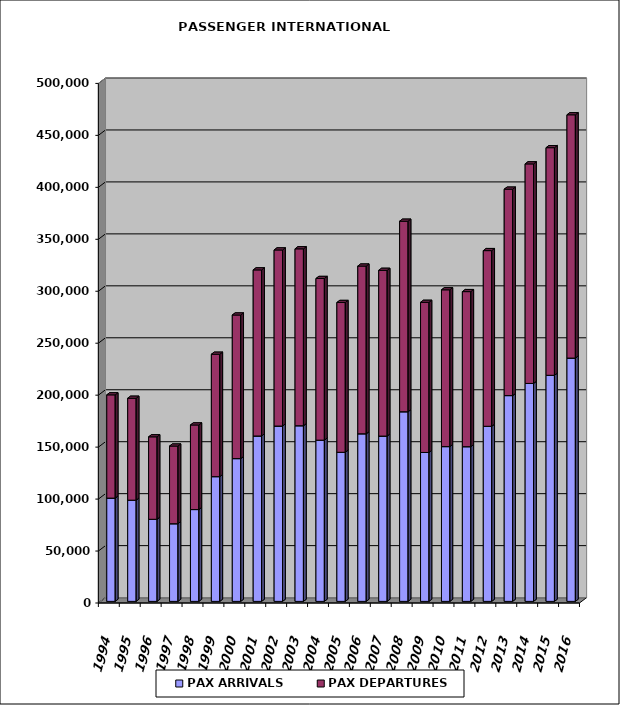
| Category | PAX ARRIVALS | PAX DEPARTURES |
|---|---|---|
| 1994.0 | 99379 | 99359 |
| 1995.0 | 97393 | 98054 |
| 1996.0 | 79006 | 79343 |
| 1997.0 | 74726 | 74735 |
| 1998.0 | 88367 | 81382 |
| 1999.0 | 120036 | 117768 |
| 2000.0 | 137392 | 138177 |
| 2001.0 | 159166 | 159814 |
| 2002.0 | 168728 | 169440 |
| 2003.0 | 169027 | 170245 |
| 2004.0 | 155136 | 155581 |
| 2005.0 | 143467 | 144154 |
| 2006.0 | 161287 | 161375 |
| 2007.0 | 159069 | 159481 |
| 2008.0 | 182481 | 183332 |
| 2009.0 | 143298 | 144461 |
| 2010.0 | 148935 | 150889 |
| 2011.0 | 148858 | 149230 |
| 2012.0 | 168496 | 169047 |
| 2013.0 | 198033 | 198630 |
| 2014.0 | 209725 | 211264 |
| 2015.0 | 217567 | 219020 |
| 2016.0 | 234131 | 234112 |